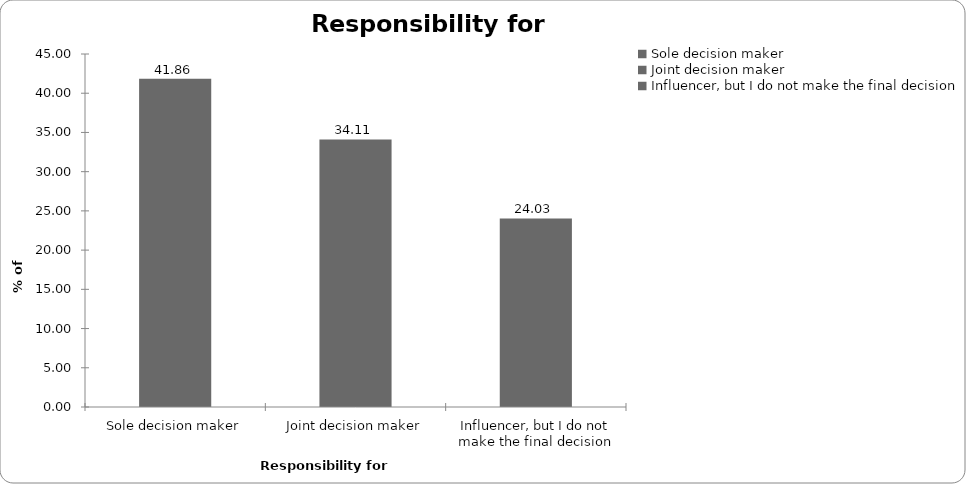
| Category | Responsibility for insurance |
|---|---|
| Sole decision maker | 41.856 |
| Joint decision maker | 34.112 |
| Influencer, but I do not make the final decision | 24.032 |